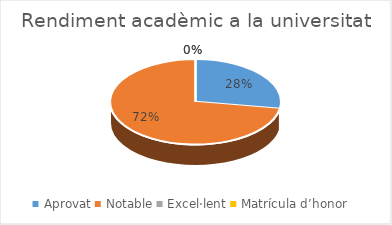
| Category | Series 0 |
|---|---|
| Aprovat | 32 |
| Notable | 84 |
| Excel·lent | 0 |
| Matrícula d’honor | 0 |